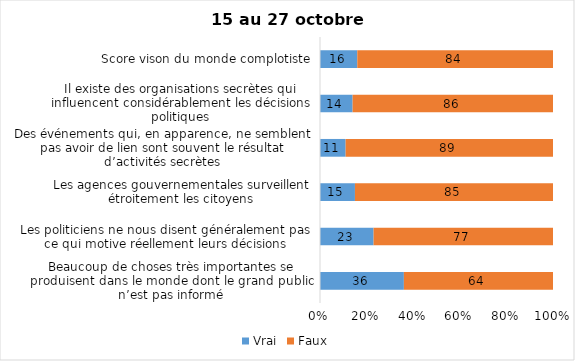
| Category | Vrai | Faux |
|---|---|---|
| Beaucoup de choses très importantes se produisent dans le monde dont le grand public n’est pas informé | 36 | 64 |
| Les politiciens ne nous disent généralement pas ce qui motive réellement leurs décisions | 23 | 77 |
| Les agences gouvernementales surveillent étroitement les citoyens | 15 | 85 |
| Des événements qui, en apparence, ne semblent pas avoir de lien sont souvent le résultat d’activités secrètes | 11 | 89 |
| Il existe des organisations secrètes qui influencent considérablement les décisions politiques | 14 | 86 |
| Score vison du monde complotiste | 16 | 84 |